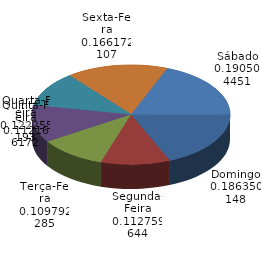
| Category | Qtde Acidentes |
|---|---|
| Domingo | 314 |
| Segunda-Feira | 190 |
| Terça-Feira | 185 |
| Quarta-Feira | 206 |
| Quinta-Feira | 189 |
| Sexta-Feira | 280 |
| Sábado | 321 |